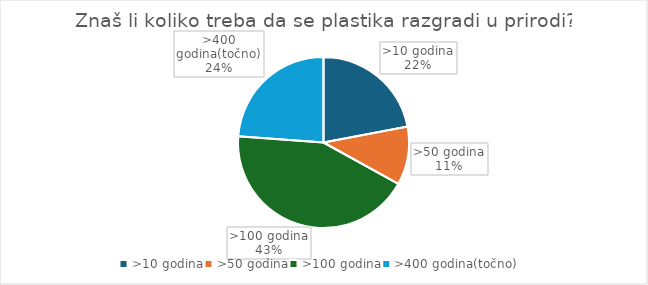
| Category | Series 0 |
|---|---|
| >10 godina | 24 |
| >50 godina | 12 |
| >100 godina | 47 |
| >400 godina(točno) | 26 |